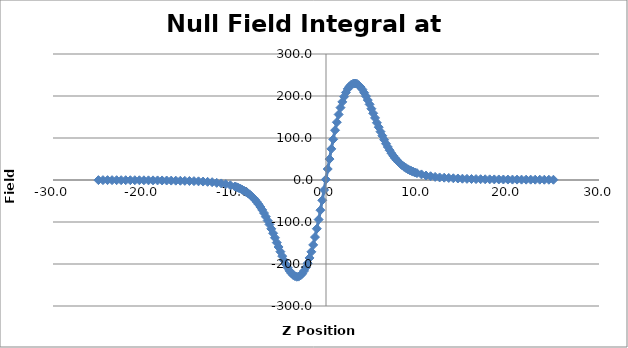
| Category | Series 0 |
|---|---|
| -25.009 | -0.295 |
| -24.509 | -0.309 |
| -24.006 | -0.333 |
| -23.509 | -0.374 |
| -23.008000000000003 | -0.414 |
| -22.509 | -0.454 |
| -22.01 | -0.5 |
| -21.505000000000003 | -0.543 |
| -21.009 | -0.589 |
| -20.509 | -0.651 |
| -20.008000000000003 | -0.717 |
| -19.509 | -0.803 |
| -19.006 | -0.888 |
| -18.507 | -0.981 |
| -18.011000000000003 | -1.103 |
| -17.507 | -1.223 |
| -17.01 | -1.391 |
| -16.509 | -1.584 |
| -16.007 | -1.782 |
| -15.511000000000003 | -2.045 |
| -15.010000000000002 | -2.354 |
| -14.509 | -2.711 |
| -14.010000000000002 | -3.159 |
| -13.507000000000001 | -3.705 |
| -13.010000000000002 | -4.356 |
| -12.512 | -5.212 |
| -12.008000000000003 | -6.767 |
| -11.509 | -8.172 |
| -11.007000000000005 | -9.867 |
| -10.509 | -12.607 |
| -10.013000000000005 | -15.496 |
| -9.811 | -17.088 |
| -9.609000000000002 | -18.786 |
| -9.408000000000001 | -20.623 |
| -9.21 | -22.997 |
| -9.009 | -25.517 |
| -8.807000000000002 | -28.152 |
| -8.607 | -31.053 |
| -8.410000000000004 | -34.026 |
| -8.209000000000003 | -38.156 |
| -8.008000000000003 | -42.293 |
| -7.809000000000005 | -46.729 |
| -7.6129999999999995 | -52.076 |
| -7.413000000000004 | -57.705 |
| -7.2109999999999985 | -64.189 |
| -7.010000000000005 | -71.197 |
| -6.812000000000005 | -78.654 |
| -6.609999999999999 | -87.419 |
| -6.408000000000001 | -96.667 |
| -6.207999999999998 | -105.882 |
| -6.010000000000005 | -116.235 |
| -5.810000000000002 | -126.817 |
| -5.609000000000002 | -137.562 |
| -5.408999999999999 | -149.054 |
| -5.213000000000001 | -159.489 |
| -5.0120000000000005 | -170.638 |
| -4.811 | -181.256 |
| -4.609999999999999 | -191.194 |
| -4.411999999999999 | -200.494 |
| -4.210000000000001 | -208.86 |
| -4.008000000000003 | -216.262 |
| -3.807000000000002 | -222.012 |
| -3.6099999999999994 | -226.304 |
| -3.4100000000000037 | -229.005 |
| -3.2079999999999984 | -230.296 |
| -3.0090000000000003 | -230.016 |
| -2.8130000000000024 | -227.371 |
| -2.612000000000002 | -223.238 |
| -2.4110000000000014 | -216.467 |
| -2.210000000000001 | -208.216 |
| -2.0120000000000005 | -198.258 |
| -1.811 | -185.607 |
| -1.608000000000004 | -170.966 |
| -1.4070000000000036 | -154.529 |
| -1.2090000000000032 | -135.911 |
| -1.0090000000000003 | -116.069 |
| -0.8070000000000022 | -94.249 |
| -0.6080000000000041 | -71.853 |
| -0.41100000000000136 | -48.286 |
| -0.21099999999999852 | -23.826 |
| -0.010000000000005116 | 1.371 |
| 0.18999999999999773 | 26.157 |
| 0.3879999999999981 | 49.876 |
| 0.5889999999999986 | 74.079 |
| 0.7920000000000016 | 96.845 |
| 0.992999999999995 | 118.433 |
| 1.1909999999999954 | 137.518 |
| 1.3909999999999982 | 156.033 |
| 1.5929999999999964 | 172.307 |
| 1.7929999999999993 | 185.96 |
| 1.9889999999999972 | 198.373 |
| 2.189 | 208.403 |
| 2.3900000000000006 | 216.826 |
| 2.5899999999999963 | 222.879 |
| 2.786999999999999 | 227.063 |
| 2.988999999999997 | 229.45 |
| 3.1909999999999954 | 229.759 |
| 3.391999999999996 | 229.175 |
| 3.5899999999999963 | 225.664 |
| 3.790999999999997 | 221.434 |
| 3.992999999999995 | 215.6 |
| 4.192999999999998 | 207.8 |
| 4.390999999999998 | 199.589 |
| 4.589999999999996 | 190.354 |
| 4.790999999999997 | 180.131 |
| 4.991 | 169.687 |
| 5.187999999999995 | 158.836 |
| 5.388999999999996 | 147.805 |
| 5.591000000000001 | 136.298 |
| 5.792000000000002 | 125.778 |
| 5.989999999999995 | 115.075 |
| 6.189999999999998 | 105.295 |
| 6.391999999999996 | 95.827 |
| 6.594000000000001 | 86.346 |
| 6.790999999999997 | 78.641 |
| 6.991 | 70.878 |
| 7.192 | 63.798 |
| 7.391999999999996 | 57.507 |
| 7.588999999999999 | 51.967 |
| 7.7890000000000015 | 47.259 |
| 7.991 | 42.43 |
| 8.192 | 38.148 |
| 8.39 | 34.538 |
| 8.591000000000001 | 31.202 |
| 8.793 | 28.362 |
| 8.992999999999995 | 25.619 |
| 9.190999999999995 | 23.306 |
| 9.390999999999998 | 21.482 |
| 9.591999999999999 | 19.736 |
| 9.793 | 17.874 |
| 9.989999999999995 | 16.338 |
| 10.491999999999997 | 13.288 |
| 10.989999999999995 | 10.604 |
| 11.492999999999995 | 8.956 |
| 11.992999999999995 | 7.39 |
| 12.488999999999997 | 6.065 |
| 12.991 | 5.491 |
| 13.491 | 4.811 |
| 13.991 | 4.128 |
| 14.494 | 3.584 |
| 14.989999999999995 | 3.112 |
| 15.491 | 2.716 |
| 15.991999999999997 | 2.413 |
| 16.489999999999995 | 2.133 |
| 16.992999999999995 | 1.912 |
| 17.491 | 1.69 |
| 17.988 | 1.529 |
| 18.491 | 1.391 |
| 18.988999999999997 | 1.265 |
| 19.492000000000004 | 1.169 |
| 19.991 | 1.072 |
| 20.488 | 1.003 |
| 20.992000000000004 | 0.934 |
| 21.489999999999995 | 0.881 |
| 21.991 | 0.822 |
| 22.492000000000004 | 0.787 |
| 22.989000000000004 | 0.742 |
| 23.491 | 0.71 |
| 23.991 | 0.653 |
| 24.489999999999995 | 0.638 |
| 24.992999999999995 | 0.615 |